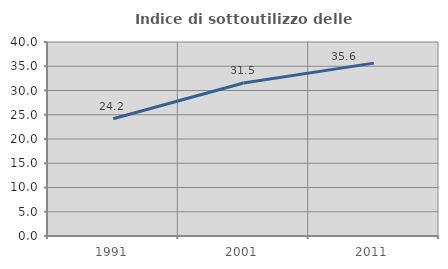
| Category | Indice di sottoutilizzo delle abitazioni  |
|---|---|
| 1991.0 | 24.188 |
| 2001.0 | 31.549 |
| 2011.0 | 35.641 |